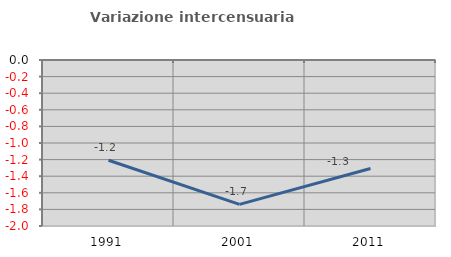
| Category | Variazione intercensuaria annua |
|---|---|
| 1991.0 | -1.208 |
| 2001.0 | -1.739 |
| 2011.0 | -1.308 |